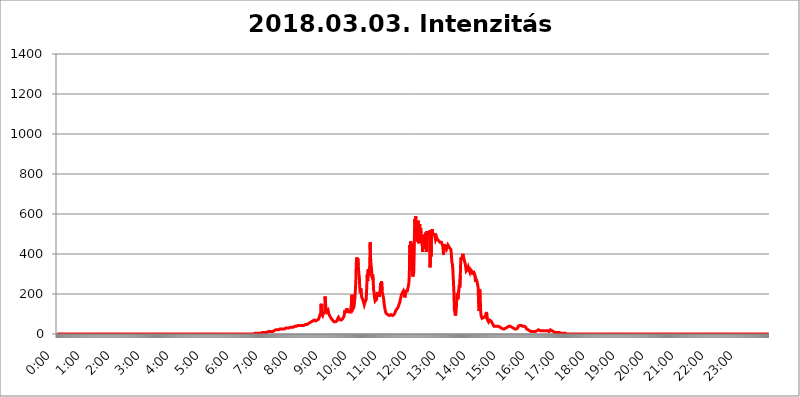
| Category | 2018.03.03. Intenzitás [W/m^2] |
|---|---|
| 0.0 | 0 |
| 0.0006944444444444445 | 0 |
| 0.001388888888888889 | 0 |
| 0.0020833333333333333 | 0 |
| 0.002777777777777778 | 0 |
| 0.003472222222222222 | 0 |
| 0.004166666666666667 | 0 |
| 0.004861111111111111 | 0 |
| 0.005555555555555556 | 0 |
| 0.0062499999999999995 | 0 |
| 0.006944444444444444 | 0 |
| 0.007638888888888889 | 0 |
| 0.008333333333333333 | 0 |
| 0.009027777777777779 | 0 |
| 0.009722222222222222 | 0 |
| 0.010416666666666666 | 0 |
| 0.011111111111111112 | 0 |
| 0.011805555555555555 | 0 |
| 0.012499999999999999 | 0 |
| 0.013194444444444444 | 0 |
| 0.013888888888888888 | 0 |
| 0.014583333333333332 | 0 |
| 0.015277777777777777 | 0 |
| 0.015972222222222224 | 0 |
| 0.016666666666666666 | 0 |
| 0.017361111111111112 | 0 |
| 0.018055555555555557 | 0 |
| 0.01875 | 0 |
| 0.019444444444444445 | 0 |
| 0.02013888888888889 | 0 |
| 0.020833333333333332 | 0 |
| 0.02152777777777778 | 0 |
| 0.022222222222222223 | 0 |
| 0.02291666666666667 | 0 |
| 0.02361111111111111 | 0 |
| 0.024305555555555556 | 0 |
| 0.024999999999999998 | 0 |
| 0.025694444444444447 | 0 |
| 0.02638888888888889 | 0 |
| 0.027083333333333334 | 0 |
| 0.027777777777777776 | 0 |
| 0.02847222222222222 | 0 |
| 0.029166666666666664 | 0 |
| 0.029861111111111113 | 0 |
| 0.030555555555555555 | 0 |
| 0.03125 | 0 |
| 0.03194444444444445 | 0 |
| 0.03263888888888889 | 0 |
| 0.03333333333333333 | 0 |
| 0.034027777777777775 | 0 |
| 0.034722222222222224 | 0 |
| 0.035416666666666666 | 0 |
| 0.036111111111111115 | 0 |
| 0.03680555555555556 | 0 |
| 0.0375 | 0 |
| 0.03819444444444444 | 0 |
| 0.03888888888888889 | 0 |
| 0.03958333333333333 | 0 |
| 0.04027777777777778 | 0 |
| 0.04097222222222222 | 0 |
| 0.041666666666666664 | 0 |
| 0.042361111111111106 | 0 |
| 0.04305555555555556 | 0 |
| 0.043750000000000004 | 0 |
| 0.044444444444444446 | 0 |
| 0.04513888888888889 | 0 |
| 0.04583333333333334 | 0 |
| 0.04652777777777778 | 0 |
| 0.04722222222222222 | 0 |
| 0.04791666666666666 | 0 |
| 0.04861111111111111 | 0 |
| 0.049305555555555554 | 0 |
| 0.049999999999999996 | 0 |
| 0.05069444444444445 | 0 |
| 0.051388888888888894 | 0 |
| 0.052083333333333336 | 0 |
| 0.05277777777777778 | 0 |
| 0.05347222222222222 | 0 |
| 0.05416666666666667 | 0 |
| 0.05486111111111111 | 0 |
| 0.05555555555555555 | 0 |
| 0.05625 | 0 |
| 0.05694444444444444 | 0 |
| 0.057638888888888885 | 0 |
| 0.05833333333333333 | 0 |
| 0.05902777777777778 | 0 |
| 0.059722222222222225 | 0 |
| 0.06041666666666667 | 0 |
| 0.061111111111111116 | 0 |
| 0.06180555555555556 | 0 |
| 0.0625 | 0 |
| 0.06319444444444444 | 0 |
| 0.06388888888888888 | 0 |
| 0.06458333333333334 | 0 |
| 0.06527777777777778 | 0 |
| 0.06597222222222222 | 0 |
| 0.06666666666666667 | 0 |
| 0.06736111111111111 | 0 |
| 0.06805555555555555 | 0 |
| 0.06874999999999999 | 0 |
| 0.06944444444444443 | 0 |
| 0.07013888888888889 | 0 |
| 0.07083333333333333 | 0 |
| 0.07152777777777779 | 0 |
| 0.07222222222222223 | 0 |
| 0.07291666666666667 | 0 |
| 0.07361111111111111 | 0 |
| 0.07430555555555556 | 0 |
| 0.075 | 0 |
| 0.07569444444444444 | 0 |
| 0.0763888888888889 | 0 |
| 0.07708333333333334 | 0 |
| 0.07777777777777778 | 0 |
| 0.07847222222222222 | 0 |
| 0.07916666666666666 | 0 |
| 0.0798611111111111 | 0 |
| 0.08055555555555556 | 0 |
| 0.08125 | 0 |
| 0.08194444444444444 | 0 |
| 0.08263888888888889 | 0 |
| 0.08333333333333333 | 0 |
| 0.08402777777777777 | 0 |
| 0.08472222222222221 | 0 |
| 0.08541666666666665 | 0 |
| 0.08611111111111112 | 0 |
| 0.08680555555555557 | 0 |
| 0.08750000000000001 | 0 |
| 0.08819444444444445 | 0 |
| 0.08888888888888889 | 0 |
| 0.08958333333333333 | 0 |
| 0.09027777777777778 | 0 |
| 0.09097222222222222 | 0 |
| 0.09166666666666667 | 0 |
| 0.09236111111111112 | 0 |
| 0.09305555555555556 | 0 |
| 0.09375 | 0 |
| 0.09444444444444444 | 0 |
| 0.09513888888888888 | 0 |
| 0.09583333333333333 | 0 |
| 0.09652777777777777 | 0 |
| 0.09722222222222222 | 0 |
| 0.09791666666666667 | 0 |
| 0.09861111111111111 | 0 |
| 0.09930555555555555 | 0 |
| 0.09999999999999999 | 0 |
| 0.10069444444444443 | 0 |
| 0.1013888888888889 | 0 |
| 0.10208333333333335 | 0 |
| 0.10277777777777779 | 0 |
| 0.10347222222222223 | 0 |
| 0.10416666666666667 | 0 |
| 0.10486111111111111 | 0 |
| 0.10555555555555556 | 0 |
| 0.10625 | 0 |
| 0.10694444444444444 | 0 |
| 0.1076388888888889 | 0 |
| 0.10833333333333334 | 0 |
| 0.10902777777777778 | 0 |
| 0.10972222222222222 | 0 |
| 0.1111111111111111 | 0 |
| 0.11180555555555556 | 0 |
| 0.11180555555555556 | 0 |
| 0.1125 | 0 |
| 0.11319444444444444 | 0 |
| 0.11388888888888889 | 0 |
| 0.11458333333333333 | 0 |
| 0.11527777777777777 | 0 |
| 0.11597222222222221 | 0 |
| 0.11666666666666665 | 0 |
| 0.1173611111111111 | 0 |
| 0.11805555555555557 | 0 |
| 0.11944444444444445 | 0 |
| 0.12013888888888889 | 0 |
| 0.12083333333333333 | 0 |
| 0.12152777777777778 | 0 |
| 0.12222222222222223 | 0 |
| 0.12291666666666667 | 0 |
| 0.12291666666666667 | 0 |
| 0.12361111111111112 | 0 |
| 0.12430555555555556 | 0 |
| 0.125 | 0 |
| 0.12569444444444444 | 0 |
| 0.12638888888888888 | 0 |
| 0.12708333333333333 | 0 |
| 0.16875 | 0 |
| 0.12847222222222224 | 0 |
| 0.12916666666666668 | 0 |
| 0.12986111111111112 | 0 |
| 0.13055555555555556 | 0 |
| 0.13125 | 0 |
| 0.13194444444444445 | 0 |
| 0.1326388888888889 | 0 |
| 0.13333333333333333 | 0 |
| 0.13402777777777777 | 0 |
| 0.13402777777777777 | 0 |
| 0.13472222222222222 | 0 |
| 0.13541666666666666 | 0 |
| 0.1361111111111111 | 0 |
| 0.13749999999999998 | 0 |
| 0.13819444444444443 | 0 |
| 0.1388888888888889 | 0 |
| 0.13958333333333334 | 0 |
| 0.14027777777777778 | 0 |
| 0.14097222222222222 | 0 |
| 0.14166666666666666 | 0 |
| 0.1423611111111111 | 0 |
| 0.14305555555555557 | 0 |
| 0.14375000000000002 | 0 |
| 0.14444444444444446 | 0 |
| 0.1451388888888889 | 0 |
| 0.1451388888888889 | 0 |
| 0.14652777777777778 | 0 |
| 0.14722222222222223 | 0 |
| 0.14791666666666667 | 0 |
| 0.1486111111111111 | 0 |
| 0.14930555555555555 | 0 |
| 0.15 | 0 |
| 0.15069444444444444 | 0 |
| 0.15138888888888888 | 0 |
| 0.15208333333333332 | 0 |
| 0.15277777777777776 | 0 |
| 0.15347222222222223 | 0 |
| 0.15416666666666667 | 0 |
| 0.15486111111111112 | 0 |
| 0.15555555555555556 | 0 |
| 0.15625 | 0 |
| 0.15694444444444444 | 0 |
| 0.15763888888888888 | 0 |
| 0.15833333333333333 | 0 |
| 0.15902777777777777 | 0 |
| 0.15972222222222224 | 0 |
| 0.16041666666666668 | 0 |
| 0.16111111111111112 | 0 |
| 0.16180555555555556 | 0 |
| 0.1625 | 0 |
| 0.16319444444444445 | 0 |
| 0.1638888888888889 | 0 |
| 0.16458333333333333 | 0 |
| 0.16527777777777777 | 0 |
| 0.16597222222222222 | 0 |
| 0.16666666666666666 | 0 |
| 0.1673611111111111 | 0 |
| 0.16805555555555554 | 0 |
| 0.16874999999999998 | 0 |
| 0.16944444444444443 | 0 |
| 0.17013888888888887 | 0 |
| 0.1708333333333333 | 0 |
| 0.17152777777777775 | 0 |
| 0.17222222222222225 | 0 |
| 0.1729166666666667 | 0 |
| 0.17361111111111113 | 0 |
| 0.17430555555555557 | 0 |
| 0.17500000000000002 | 0 |
| 0.17569444444444446 | 0 |
| 0.1763888888888889 | 0 |
| 0.17708333333333334 | 0 |
| 0.17777777777777778 | 0 |
| 0.17847222222222223 | 0 |
| 0.17916666666666667 | 0 |
| 0.1798611111111111 | 0 |
| 0.18055555555555555 | 0 |
| 0.18125 | 0 |
| 0.18194444444444444 | 0 |
| 0.1826388888888889 | 0 |
| 0.18333333333333335 | 0 |
| 0.1840277777777778 | 0 |
| 0.18472222222222223 | 0 |
| 0.18541666666666667 | 0 |
| 0.18611111111111112 | 0 |
| 0.18680555555555556 | 0 |
| 0.1875 | 0 |
| 0.18819444444444444 | 0 |
| 0.18888888888888888 | 0 |
| 0.18958333333333333 | 0 |
| 0.19027777777777777 | 0 |
| 0.1909722222222222 | 0 |
| 0.19166666666666665 | 0 |
| 0.19236111111111112 | 0 |
| 0.19305555555555554 | 0 |
| 0.19375 | 0 |
| 0.19444444444444445 | 0 |
| 0.1951388888888889 | 0 |
| 0.19583333333333333 | 0 |
| 0.19652777777777777 | 0 |
| 0.19722222222222222 | 0 |
| 0.19791666666666666 | 0 |
| 0.1986111111111111 | 0 |
| 0.19930555555555554 | 0 |
| 0.19999999999999998 | 0 |
| 0.20069444444444443 | 0 |
| 0.20138888888888887 | 0 |
| 0.2020833333333333 | 0 |
| 0.2027777777777778 | 0 |
| 0.2034722222222222 | 0 |
| 0.2041666666666667 | 0 |
| 0.20486111111111113 | 0 |
| 0.20555555555555557 | 0 |
| 0.20625000000000002 | 0 |
| 0.20694444444444446 | 0 |
| 0.2076388888888889 | 0 |
| 0.20833333333333334 | 0 |
| 0.20902777777777778 | 0 |
| 0.20972222222222223 | 0 |
| 0.21041666666666667 | 0 |
| 0.2111111111111111 | 0 |
| 0.21180555555555555 | 0 |
| 0.2125 | 0 |
| 0.21319444444444444 | 0 |
| 0.2138888888888889 | 0 |
| 0.21458333333333335 | 0 |
| 0.2152777777777778 | 0 |
| 0.21597222222222223 | 0 |
| 0.21666666666666667 | 0 |
| 0.21736111111111112 | 0 |
| 0.21805555555555556 | 0 |
| 0.21875 | 0 |
| 0.21944444444444444 | 0 |
| 0.22013888888888888 | 0 |
| 0.22083333333333333 | 0 |
| 0.22152777777777777 | 0 |
| 0.2222222222222222 | 0 |
| 0.22291666666666665 | 0 |
| 0.2236111111111111 | 0 |
| 0.22430555555555556 | 0 |
| 0.225 | 0 |
| 0.22569444444444445 | 0 |
| 0.2263888888888889 | 0 |
| 0.22708333333333333 | 0 |
| 0.22777777777777777 | 0 |
| 0.22847222222222222 | 0 |
| 0.22916666666666666 | 0 |
| 0.2298611111111111 | 0 |
| 0.23055555555555554 | 0 |
| 0.23124999999999998 | 0 |
| 0.23194444444444443 | 0 |
| 0.23263888888888887 | 0 |
| 0.2333333333333333 | 0 |
| 0.2340277777777778 | 0 |
| 0.2347222222222222 | 0 |
| 0.2354166666666667 | 0 |
| 0.23611111111111113 | 0 |
| 0.23680555555555557 | 0 |
| 0.23750000000000002 | 0 |
| 0.23819444444444446 | 0 |
| 0.2388888888888889 | 0 |
| 0.23958333333333334 | 0 |
| 0.24027777777777778 | 0 |
| 0.24097222222222223 | 0 |
| 0.24166666666666667 | 0 |
| 0.2423611111111111 | 0 |
| 0.24305555555555555 | 0 |
| 0.24375 | 0 |
| 0.24444444444444446 | 0 |
| 0.24513888888888888 | 0 |
| 0.24583333333333335 | 0 |
| 0.2465277777777778 | 0 |
| 0.24722222222222223 | 0 |
| 0.24791666666666667 | 0 |
| 0.24861111111111112 | 0 |
| 0.24930555555555556 | 0 |
| 0.25 | 0 |
| 0.25069444444444444 | 0 |
| 0.2513888888888889 | 0 |
| 0.2520833333333333 | 0 |
| 0.25277777777777777 | 0 |
| 0.2534722222222222 | 0 |
| 0.25416666666666665 | 0 |
| 0.2548611111111111 | 0 |
| 0.2555555555555556 | 0 |
| 0.25625000000000003 | 0 |
| 0.2569444444444445 | 0 |
| 0.2576388888888889 | 0 |
| 0.25833333333333336 | 0 |
| 0.2590277777777778 | 0 |
| 0.25972222222222224 | 0 |
| 0.2604166666666667 | 0 |
| 0.2611111111111111 | 0 |
| 0.26180555555555557 | 0 |
| 0.2625 | 0 |
| 0.26319444444444445 | 0 |
| 0.2638888888888889 | 0 |
| 0.26458333333333334 | 0 |
| 0.2652777777777778 | 0 |
| 0.2659722222222222 | 0 |
| 0.26666666666666666 | 0 |
| 0.2673611111111111 | 0 |
| 0.26805555555555555 | 0 |
| 0.26875 | 0 |
| 0.26944444444444443 | 0 |
| 0.2701388888888889 | 0 |
| 0.2708333333333333 | 0 |
| 0.27152777777777776 | 0 |
| 0.2722222222222222 | 0 |
| 0.27291666666666664 | 0 |
| 0.2736111111111111 | 0 |
| 0.2743055555555555 | 0 |
| 0.27499999999999997 | 0 |
| 0.27569444444444446 | 0 |
| 0.27638888888888885 | 0 |
| 0.27708333333333335 | 3.525 |
| 0.2777777777777778 | 3.525 |
| 0.27847222222222223 | 3.525 |
| 0.2791666666666667 | 3.525 |
| 0.2798611111111111 | 3.525 |
| 0.28055555555555556 | 3.525 |
| 0.28125 | 3.525 |
| 0.28194444444444444 | 3.525 |
| 0.2826388888888889 | 3.525 |
| 0.2833333333333333 | 3.525 |
| 0.28402777777777777 | 3.525 |
| 0.2847222222222222 | 3.525 |
| 0.28541666666666665 | 3.525 |
| 0.28611111111111115 | 3.525 |
| 0.28680555555555554 | 3.525 |
| 0.28750000000000003 | 7.887 |
| 0.2881944444444445 | 7.887 |
| 0.2888888888888889 | 3.525 |
| 0.28958333333333336 | 7.887 |
| 0.2902777777777778 | 7.887 |
| 0.29097222222222224 | 7.887 |
| 0.2916666666666667 | 7.887 |
| 0.2923611111111111 | 7.887 |
| 0.29305555555555557 | 7.887 |
| 0.29375 | 7.887 |
| 0.29444444444444445 | 12.257 |
| 0.2951388888888889 | 12.257 |
| 0.29583333333333334 | 12.257 |
| 0.2965277777777778 | 12.257 |
| 0.2972222222222222 | 12.257 |
| 0.29791666666666666 | 12.257 |
| 0.2986111111111111 | 12.257 |
| 0.29930555555555555 | 12.257 |
| 0.3 | 12.257 |
| 0.30069444444444443 | 12.257 |
| 0.3013888888888889 | 12.257 |
| 0.3020833333333333 | 12.257 |
| 0.30277777777777776 | 16.636 |
| 0.3034722222222222 | 16.636 |
| 0.30416666666666664 | 16.636 |
| 0.3048611111111111 | 16.636 |
| 0.3055555555555555 | 16.636 |
| 0.30624999999999997 | 21.024 |
| 0.3069444444444444 | 21.024 |
| 0.3076388888888889 | 21.024 |
| 0.30833333333333335 | 21.024 |
| 0.3090277777777778 | 21.024 |
| 0.30972222222222223 | 21.024 |
| 0.3104166666666667 | 21.024 |
| 0.3111111111111111 | 21.024 |
| 0.31180555555555556 | 25.419 |
| 0.3125 | 25.419 |
| 0.31319444444444444 | 21.024 |
| 0.3138888888888889 | 21.024 |
| 0.3145833333333333 | 25.419 |
| 0.31527777777777777 | 25.419 |
| 0.3159722222222222 | 25.419 |
| 0.31666666666666665 | 25.419 |
| 0.31736111111111115 | 25.419 |
| 0.31805555555555554 | 25.419 |
| 0.31875000000000003 | 25.419 |
| 0.3194444444444445 | 25.419 |
| 0.3201388888888889 | 29.823 |
| 0.32083333333333336 | 29.823 |
| 0.3215277777777778 | 29.823 |
| 0.32222222222222224 | 29.823 |
| 0.3229166666666667 | 29.823 |
| 0.3236111111111111 | 29.823 |
| 0.32430555555555557 | 29.823 |
| 0.325 | 29.823 |
| 0.32569444444444445 | 29.823 |
| 0.3263888888888889 | 29.823 |
| 0.32708333333333334 | 34.234 |
| 0.3277777777777778 | 29.823 |
| 0.3284722222222222 | 29.823 |
| 0.32916666666666666 | 34.234 |
| 0.3298611111111111 | 34.234 |
| 0.33055555555555555 | 34.234 |
| 0.33125 | 34.234 |
| 0.33194444444444443 | 34.234 |
| 0.3326388888888889 | 38.653 |
| 0.3333333333333333 | 38.653 |
| 0.3340277777777778 | 38.653 |
| 0.3347222222222222 | 38.653 |
| 0.3354166666666667 | 38.653 |
| 0.3361111111111111 | 38.653 |
| 0.3368055555555556 | 38.653 |
| 0.33749999999999997 | 43.079 |
| 0.33819444444444446 | 43.079 |
| 0.33888888888888885 | 43.079 |
| 0.33958333333333335 | 43.079 |
| 0.34027777777777773 | 43.079 |
| 0.34097222222222223 | 43.079 |
| 0.3416666666666666 | 43.079 |
| 0.3423611111111111 | 43.079 |
| 0.3430555555555555 | 43.079 |
| 0.34375 | 43.079 |
| 0.3444444444444445 | 43.079 |
| 0.3451388888888889 | 43.079 |
| 0.3458333333333334 | 43.079 |
| 0.34652777777777777 | 43.079 |
| 0.34722222222222227 | 47.511 |
| 0.34791666666666665 | 47.511 |
| 0.34861111111111115 | 47.511 |
| 0.34930555555555554 | 47.511 |
| 0.35000000000000003 | 47.511 |
| 0.3506944444444444 | 47.511 |
| 0.3513888888888889 | 47.511 |
| 0.3520833333333333 | 51.951 |
| 0.3527777777777778 | 51.951 |
| 0.3534722222222222 | 51.951 |
| 0.3541666666666667 | 56.398 |
| 0.3548611111111111 | 56.398 |
| 0.35555555555555557 | 56.398 |
| 0.35625 | 60.85 |
| 0.35694444444444445 | 60.85 |
| 0.3576388888888889 | 65.31 |
| 0.35833333333333334 | 65.31 |
| 0.3590277777777778 | 65.31 |
| 0.3597222222222222 | 65.31 |
| 0.36041666666666666 | 69.775 |
| 0.3611111111111111 | 69.775 |
| 0.36180555555555555 | 69.775 |
| 0.3625 | 65.31 |
| 0.36319444444444443 | 65.31 |
| 0.3638888888888889 | 65.31 |
| 0.3645833333333333 | 69.775 |
| 0.3652777777777778 | 69.775 |
| 0.3659722222222222 | 74.246 |
| 0.3666666666666667 | 74.246 |
| 0.3673611111111111 | 83.205 |
| 0.3680555555555556 | 78.722 |
| 0.36874999999999997 | 78.722 |
| 0.36944444444444446 | 105.69 |
| 0.37013888888888885 | 150.964 |
| 0.37083333333333335 | 101.184 |
| 0.37152777777777773 | 96.682 |
| 0.37222222222222223 | 92.184 |
| 0.3729166666666666 | 101.184 |
| 0.3736111111111111 | 105.69 |
| 0.3743055555555555 | 105.69 |
| 0.375 | 110.201 |
| 0.3756944444444445 | 187.378 |
| 0.3763888888888889 | 150.964 |
| 0.3770833333333334 | 119.235 |
| 0.37777777777777777 | 110.201 |
| 0.37847222222222227 | 105.69 |
| 0.37916666666666665 | 110.201 |
| 0.37986111111111115 | 119.235 |
| 0.38055555555555554 | 105.69 |
| 0.38125000000000003 | 96.682 |
| 0.3819444444444444 | 92.184 |
| 0.3826388888888889 | 87.692 |
| 0.3833333333333333 | 83.205 |
| 0.3840277777777778 | 78.722 |
| 0.3847222222222222 | 74.246 |
| 0.3854166666666667 | 74.246 |
| 0.3861111111111111 | 69.775 |
| 0.38680555555555557 | 65.31 |
| 0.3875 | 65.31 |
| 0.38819444444444445 | 60.85 |
| 0.3888888888888889 | 60.85 |
| 0.38958333333333334 | 60.85 |
| 0.3902777777777778 | 60.85 |
| 0.3909722222222222 | 65.31 |
| 0.39166666666666666 | 65.31 |
| 0.3923611111111111 | 65.31 |
| 0.39305555555555555 | 74.246 |
| 0.39375 | 78.722 |
| 0.39444444444444443 | 83.205 |
| 0.3951388888888889 | 78.722 |
| 0.3958333333333333 | 74.246 |
| 0.3965277777777778 | 74.246 |
| 0.3972222222222222 | 69.775 |
| 0.3979166666666667 | 69.775 |
| 0.3986111111111111 | 69.775 |
| 0.3993055555555556 | 74.246 |
| 0.39999999999999997 | 74.246 |
| 0.40069444444444446 | 74.246 |
| 0.40138888888888885 | 78.722 |
| 0.40208333333333335 | 87.692 |
| 0.40277777777777773 | 101.184 |
| 0.40347222222222223 | 119.235 |
| 0.4041666666666666 | 105.69 |
| 0.4048611111111111 | 105.69 |
| 0.4055555555555555 | 110.201 |
| 0.40625 | 128.284 |
| 0.4069444444444445 | 114.716 |
| 0.4076388888888889 | 110.201 |
| 0.4083333333333334 | 110.201 |
| 0.40902777777777777 | 110.201 |
| 0.40972222222222227 | 110.201 |
| 0.41041666666666665 | 114.716 |
| 0.41111111111111115 | 110.201 |
| 0.41180555555555554 | 110.201 |
| 0.41250000000000003 | 146.423 |
| 0.4131944444444444 | 196.497 |
| 0.4138888888888889 | 160.056 |
| 0.4145833333333333 | 123.758 |
| 0.4152777777777778 | 119.235 |
| 0.4159722222222222 | 132.814 |
| 0.4166666666666667 | 150.964 |
| 0.4173611111111111 | 173.709 |
| 0.41805555555555557 | 178.264 |
| 0.41875 | 260.373 |
| 0.41944444444444445 | 360.221 |
| 0.4201388888888889 | 382.715 |
| 0.42083333333333334 | 369.23 |
| 0.4215277777777778 | 378.224 |
| 0.4222222222222222 | 342.162 |
| 0.42291666666666666 | 301.354 |
| 0.4236111111111111 | 287.709 |
| 0.42430555555555555 | 233 |
| 0.425 | 205.62 |
| 0.42569444444444443 | 228.436 |
| 0.4263888888888889 | 201.058 |
| 0.4270833333333333 | 182.82 |
| 0.4277777777777778 | 182.82 |
| 0.4284722222222222 | 173.709 |
| 0.4291666666666667 | 169.156 |
| 0.4298611111111111 | 155.509 |
| 0.4305555555555556 | 146.423 |
| 0.43124999999999997 | 155.509 |
| 0.43194444444444446 | 160.056 |
| 0.43263888888888885 | 155.509 |
| 0.43333333333333335 | 173.709 |
| 0.43402777777777773 | 228.436 |
| 0.43472222222222223 | 296.808 |
| 0.4354166666666666 | 264.932 |
| 0.4361111111111111 | 324.052 |
| 0.4368055555555555 | 310.44 |
| 0.4375 | 292.259 |
| 0.4381944444444445 | 337.639 |
| 0.4388888888888889 | 458.38 |
| 0.4395833333333334 | 369.23 |
| 0.44027777777777777 | 364.728 |
| 0.44097222222222227 | 314.98 |
| 0.44166666666666665 | 278.603 |
| 0.44236111111111115 | 296.808 |
| 0.44305555555555554 | 269.49 |
| 0.44375000000000003 | 219.309 |
| 0.4444444444444444 | 205.62 |
| 0.4451388888888889 | 178.264 |
| 0.4458333333333333 | 164.605 |
| 0.4465277777777778 | 164.605 |
| 0.4472222222222222 | 164.605 |
| 0.4479166666666667 | 173.709 |
| 0.4486111111111111 | 196.497 |
| 0.44930555555555557 | 210.182 |
| 0.45 | 191.937 |
| 0.45069444444444445 | 191.937 |
| 0.4513888888888889 | 187.378 |
| 0.45208333333333334 | 191.937 |
| 0.4527777777777778 | 214.746 |
| 0.4534722222222222 | 255.813 |
| 0.45416666666666666 | 214.746 |
| 0.4548611111111111 | 264.932 |
| 0.45555555555555555 | 219.309 |
| 0.45625 | 201.058 |
| 0.45694444444444443 | 191.937 |
| 0.4576388888888889 | 178.264 |
| 0.4583333333333333 | 155.509 |
| 0.4590277777777778 | 137.347 |
| 0.4597222222222222 | 123.758 |
| 0.4604166666666667 | 110.201 |
| 0.4611111111111111 | 105.69 |
| 0.4618055555555556 | 101.184 |
| 0.46249999999999997 | 101.184 |
| 0.46319444444444446 | 96.682 |
| 0.46388888888888885 | 96.682 |
| 0.46458333333333335 | 92.184 |
| 0.46527777777777773 | 92.184 |
| 0.46597222222222223 | 92.184 |
| 0.4666666666666666 | 96.682 |
| 0.4673611111111111 | 96.682 |
| 0.4680555555555555 | 96.682 |
| 0.46875 | 92.184 |
| 0.4694444444444445 | 92.184 |
| 0.4701388888888889 | 92.184 |
| 0.4708333333333334 | 92.184 |
| 0.47152777777777777 | 92.184 |
| 0.47222222222222227 | 96.682 |
| 0.47291666666666665 | 101.184 |
| 0.47361111111111115 | 105.69 |
| 0.47430555555555554 | 110.201 |
| 0.47500000000000003 | 119.235 |
| 0.4756944444444444 | 119.235 |
| 0.4763888888888889 | 123.758 |
| 0.4770833333333333 | 128.284 |
| 0.4777777777777778 | 132.814 |
| 0.4784722222222222 | 137.347 |
| 0.4791666666666667 | 146.423 |
| 0.4798611111111111 | 150.964 |
| 0.48055555555555557 | 160.056 |
| 0.48125 | 173.709 |
| 0.48194444444444445 | 182.82 |
| 0.4826388888888889 | 196.497 |
| 0.48333333333333334 | 196.497 |
| 0.4840277777777778 | 205.62 |
| 0.4847222222222222 | 210.182 |
| 0.48541666666666666 | 214.746 |
| 0.4861111111111111 | 210.182 |
| 0.48680555555555555 | 196.497 |
| 0.4875 | 182.82 |
| 0.48819444444444443 | 191.937 |
| 0.4888888888888889 | 214.746 |
| 0.4895833333333333 | 214.746 |
| 0.4902777777777778 | 210.182 |
| 0.4909722222222222 | 214.746 |
| 0.4916666666666667 | 210.182 |
| 0.4923611111111111 | 214.746 |
| 0.4930555555555556 | 251.251 |
| 0.49374999999999997 | 287.709 |
| 0.49444444444444446 | 445.129 |
| 0.49513888888888885 | 378.224 |
| 0.49583333333333335 | 462.786 |
| 0.49652777777777773 | 414.035 |
| 0.49722222222222223 | 409.574 |
| 0.4979166666666666 | 449.551 |
| 0.4986111111111111 | 287.709 |
| 0.4993055555555555 | 296.808 |
| 0.5 | 305.898 |
| 0.5006944444444444 | 422.943 |
| 0.5013888888888889 | 575.299 |
| 0.5020833333333333 | 549.704 |
| 0.5027777777777778 | 588.009 |
| 0.5034722222222222 | 484.735 |
| 0.5041666666666667 | 545.416 |
| 0.5048611111111111 | 462.786 |
| 0.5055555555555555 | 480.356 |
| 0.50625 | 566.793 |
| 0.5069444444444444 | 453.968 |
| 0.5076388888888889 | 541.121 |
| 0.5083333333333333 | 549.704 |
| 0.5090277777777777 | 506.542 |
| 0.5097222222222222 | 528.2 |
| 0.5104166666666666 | 489.108 |
| 0.5111111111111112 | 453.968 |
| 0.5118055555555555 | 462.786 |
| 0.5125000000000001 | 409.574 |
| 0.5131944444444444 | 493.475 |
| 0.513888888888889 | 475.972 |
| 0.5145833333333333 | 427.39 |
| 0.5152777777777778 | 497.836 |
| 0.5159722222222222 | 471.582 |
| 0.5166666666666667 | 506.542 |
| 0.517361111111111 | 431.833 |
| 0.5180555555555556 | 409.574 |
| 0.5187499999999999 | 515.223 |
| 0.5194444444444445 | 506.542 |
| 0.5201388888888888 | 506.542 |
| 0.5208333333333334 | 506.542 |
| 0.5215277777777778 | 510.885 |
| 0.5222222222222223 | 502.192 |
| 0.5229166666666667 | 333.113 |
| 0.5236111111111111 | 458.38 |
| 0.5243055555555556 | 387.202 |
| 0.525 | 510.885 |
| 0.5256944444444445 | 523.88 |
| 0.5263888888888889 | 510.885 |
| 0.5270833333333333 | 497.836 |
| 0.5277777777777778 | 493.475 |
| 0.5284722222222222 | 497.836 |
| 0.5291666666666667 | 497.836 |
| 0.5298611111111111 | 484.735 |
| 0.5305555555555556 | 471.582 |
| 0.53125 | 475.972 |
| 0.5319444444444444 | 484.735 |
| 0.5326388888888889 | 475.972 |
| 0.5333333333333333 | 480.356 |
| 0.5340277777777778 | 480.356 |
| 0.5347222222222222 | 467.187 |
| 0.5354166666666667 | 471.582 |
| 0.5361111111111111 | 471.582 |
| 0.5368055555555555 | 458.38 |
| 0.5375 | 462.786 |
| 0.5381944444444444 | 462.786 |
| 0.5388888888888889 | 458.38 |
| 0.5395833333333333 | 458.38 |
| 0.5402777777777777 | 453.968 |
| 0.5409722222222222 | 436.27 |
| 0.5416666666666666 | 396.164 |
| 0.5423611111111112 | 400.638 |
| 0.5430555555555555 | 449.551 |
| 0.5437500000000001 | 436.27 |
| 0.5444444444444444 | 436.27 |
| 0.545138888888889 | 440.702 |
| 0.5458333333333333 | 422.943 |
| 0.5465277777777778 | 418.492 |
| 0.5472222222222222 | 427.39 |
| 0.5479166666666667 | 445.129 |
| 0.548611111111111 | 449.551 |
| 0.5493055555555556 | 445.129 |
| 0.5499999999999999 | 431.833 |
| 0.5506944444444445 | 427.39 |
| 0.5513888888888888 | 436.27 |
| 0.5520833333333334 | 422.943 |
| 0.5527777777777778 | 396.164 |
| 0.5534722222222223 | 360.221 |
| 0.5541666666666667 | 351.198 |
| 0.5548611111111111 | 319.517 |
| 0.5555555555555556 | 269.49 |
| 0.55625 | 214.746 |
| 0.5569444444444445 | 123.758 |
| 0.5576388888888889 | 110.201 |
| 0.5583333333333333 | 92.184 |
| 0.5590277777777778 | 101.184 |
| 0.5597222222222222 | 128.284 |
| 0.5604166666666667 | 187.378 |
| 0.5611111111111111 | 205.62 |
| 0.5618055555555556 | 173.709 |
| 0.5625 | 173.709 |
| 0.5631944444444444 | 219.309 |
| 0.5638888888888889 | 246.689 |
| 0.5645833333333333 | 233 |
| 0.5652777777777778 | 292.259 |
| 0.5659722222222222 | 373.729 |
| 0.5666666666666667 | 382.715 |
| 0.5673611111111111 | 369.23 |
| 0.5680555555555555 | 373.729 |
| 0.56875 | 400.638 |
| 0.5694444444444444 | 396.164 |
| 0.5701388888888889 | 378.224 |
| 0.5708333333333333 | 369.23 |
| 0.5715277777777777 | 364.728 |
| 0.5722222222222222 | 351.198 |
| 0.5729166666666666 | 333.113 |
| 0.5736111111111112 | 314.98 |
| 0.5743055555555555 | 314.98 |
| 0.5750000000000001 | 314.98 |
| 0.5756944444444444 | 324.052 |
| 0.576388888888889 | 333.113 |
| 0.5770833333333333 | 324.052 |
| 0.5777777777777778 | 324.052 |
| 0.5784722222222222 | 310.44 |
| 0.5791666666666667 | 324.052 |
| 0.579861111111111 | 328.584 |
| 0.5805555555555556 | 324.052 |
| 0.5812499999999999 | 314.98 |
| 0.5819444444444445 | 310.44 |
| 0.5826388888888888 | 296.808 |
| 0.5833333333333334 | 314.98 |
| 0.5840277777777778 | 314.98 |
| 0.5847222222222223 | 314.98 |
| 0.5854166666666667 | 296.808 |
| 0.5861111111111111 | 301.354 |
| 0.5868055555555556 | 260.373 |
| 0.5875 | 274.047 |
| 0.5881944444444445 | 274.047 |
| 0.5888888888888889 | 260.373 |
| 0.5895833333333333 | 255.813 |
| 0.5902777777777778 | 233 |
| 0.5909722222222222 | 155.509 |
| 0.5916666666666667 | 114.716 |
| 0.5923611111111111 | 223.873 |
| 0.5930555555555556 | 210.182 |
| 0.59375 | 119.235 |
| 0.5944444444444444 | 92.184 |
| 0.5951388888888889 | 87.692 |
| 0.5958333333333333 | 78.722 |
| 0.5965277777777778 | 78.722 |
| 0.5972222222222222 | 83.205 |
| 0.5979166666666667 | 83.205 |
| 0.5986111111111111 | 83.205 |
| 0.5993055555555555 | 87.692 |
| 0.6 | 83.205 |
| 0.6006944444444444 | 83.205 |
| 0.6013888888888889 | 78.722 |
| 0.6020833333333333 | 110.201 |
| 0.6027777777777777 | 78.722 |
| 0.6034722222222222 | 69.775 |
| 0.6041666666666666 | 65.31 |
| 0.6048611111111112 | 60.85 |
| 0.6055555555555555 | 65.31 |
| 0.6062500000000001 | 69.775 |
| 0.6069444444444444 | 69.775 |
| 0.607638888888889 | 65.31 |
| 0.6083333333333333 | 65.31 |
| 0.6090277777777778 | 65.31 |
| 0.6097222222222222 | 56.398 |
| 0.6104166666666667 | 51.951 |
| 0.611111111111111 | 47.511 |
| 0.6118055555555556 | 43.079 |
| 0.6124999999999999 | 38.653 |
| 0.6131944444444445 | 38.653 |
| 0.6138888888888888 | 38.653 |
| 0.6145833333333334 | 38.653 |
| 0.6152777777777778 | 38.653 |
| 0.6159722222222223 | 38.653 |
| 0.6166666666666667 | 38.653 |
| 0.6173611111111111 | 38.653 |
| 0.6180555555555556 | 38.653 |
| 0.61875 | 38.653 |
| 0.6194444444444445 | 38.653 |
| 0.6201388888888889 | 38.653 |
| 0.6208333333333333 | 34.234 |
| 0.6215277777777778 | 34.234 |
| 0.6222222222222222 | 29.823 |
| 0.6229166666666667 | 29.823 |
| 0.6236111111111111 | 29.823 |
| 0.6243055555555556 | 25.419 |
| 0.625 | 25.419 |
| 0.6256944444444444 | 25.419 |
| 0.6263888888888889 | 25.419 |
| 0.6270833333333333 | 25.419 |
| 0.6277777777777778 | 29.823 |
| 0.6284722222222222 | 29.823 |
| 0.6291666666666667 | 29.823 |
| 0.6298611111111111 | 29.823 |
| 0.6305555555555555 | 34.234 |
| 0.63125 | 34.234 |
| 0.6319444444444444 | 34.234 |
| 0.6326388888888889 | 38.653 |
| 0.6333333333333333 | 38.653 |
| 0.6340277777777777 | 38.653 |
| 0.6347222222222222 | 38.653 |
| 0.6354166666666666 | 38.653 |
| 0.6361111111111112 | 34.234 |
| 0.6368055555555555 | 38.653 |
| 0.6375000000000001 | 34.234 |
| 0.6381944444444444 | 34.234 |
| 0.638888888888889 | 29.823 |
| 0.6395833333333333 | 29.823 |
| 0.6402777777777778 | 29.823 |
| 0.6409722222222222 | 29.823 |
| 0.6416666666666667 | 25.419 |
| 0.642361111111111 | 25.419 |
| 0.6430555555555556 | 25.419 |
| 0.6437499999999999 | 25.419 |
| 0.6444444444444445 | 21.024 |
| 0.6451388888888888 | 25.419 |
| 0.6458333333333334 | 29.823 |
| 0.6465277777777778 | 38.653 |
| 0.6472222222222223 | 38.653 |
| 0.6479166666666667 | 43.079 |
| 0.6486111111111111 | 43.079 |
| 0.6493055555555556 | 43.079 |
| 0.65 | 38.653 |
| 0.6506944444444445 | 43.079 |
| 0.6513888888888889 | 43.079 |
| 0.6520833333333333 | 38.653 |
| 0.6527777777777778 | 38.653 |
| 0.6534722222222222 | 38.653 |
| 0.6541666666666667 | 38.653 |
| 0.6548611111111111 | 38.653 |
| 0.6555555555555556 | 38.653 |
| 0.65625 | 34.234 |
| 0.6569444444444444 | 34.234 |
| 0.6576388888888889 | 29.823 |
| 0.6583333333333333 | 25.419 |
| 0.6590277777777778 | 21.024 |
| 0.6597222222222222 | 21.024 |
| 0.6604166666666667 | 21.024 |
| 0.6611111111111111 | 21.024 |
| 0.6618055555555555 | 16.636 |
| 0.6625 | 16.636 |
| 0.6631944444444444 | 16.636 |
| 0.6638888888888889 | 12.257 |
| 0.6645833333333333 | 12.257 |
| 0.6652777777777777 | 12.257 |
| 0.6659722222222222 | 16.636 |
| 0.6666666666666666 | 12.257 |
| 0.6673611111111111 | 12.257 |
| 0.6680555555555556 | 12.257 |
| 0.6687500000000001 | 12.257 |
| 0.6694444444444444 | 12.257 |
| 0.6701388888888888 | 12.257 |
| 0.6708333333333334 | 12.257 |
| 0.6715277777777778 | 12.257 |
| 0.6722222222222222 | 12.257 |
| 0.6729166666666666 | 16.636 |
| 0.6736111111111112 | 21.024 |
| 0.6743055555555556 | 21.024 |
| 0.6749999999999999 | 21.024 |
| 0.6756944444444444 | 21.024 |
| 0.6763888888888889 | 21.024 |
| 0.6770833333333334 | 16.636 |
| 0.6777777777777777 | 16.636 |
| 0.6784722222222223 | 16.636 |
| 0.6791666666666667 | 16.636 |
| 0.6798611111111111 | 16.636 |
| 0.6805555555555555 | 16.636 |
| 0.68125 | 16.636 |
| 0.6819444444444445 | 16.636 |
| 0.6826388888888889 | 16.636 |
| 0.6833333333333332 | 16.636 |
| 0.6840277777777778 | 16.636 |
| 0.6847222222222222 | 16.636 |
| 0.6854166666666667 | 16.636 |
| 0.686111111111111 | 16.636 |
| 0.6868055555555556 | 16.636 |
| 0.6875 | 16.636 |
| 0.6881944444444444 | 12.257 |
| 0.688888888888889 | 12.257 |
| 0.6895833333333333 | 12.257 |
| 0.6902777777777778 | 16.636 |
| 0.6909722222222222 | 16.636 |
| 0.6916666666666668 | 21.024 |
| 0.6923611111111111 | 21.024 |
| 0.6930555555555555 | 16.636 |
| 0.69375 | 16.636 |
| 0.6944444444444445 | 12.257 |
| 0.6951388888888889 | 12.257 |
| 0.6958333333333333 | 12.257 |
| 0.6965277777777777 | 12.257 |
| 0.6972222222222223 | 12.257 |
| 0.6979166666666666 | 7.887 |
| 0.6986111111111111 | 7.887 |
| 0.6993055555555556 | 7.887 |
| 0.7000000000000001 | 7.887 |
| 0.7006944444444444 | 7.887 |
| 0.7013888888888888 | 7.887 |
| 0.7020833333333334 | 7.887 |
| 0.7027777777777778 | 7.887 |
| 0.7034722222222222 | 7.887 |
| 0.7041666666666666 | 7.887 |
| 0.7048611111111112 | 7.887 |
| 0.7055555555555556 | 3.525 |
| 0.7062499999999999 | 3.525 |
| 0.7069444444444444 | 3.525 |
| 0.7076388888888889 | 3.525 |
| 0.7083333333333334 | 3.525 |
| 0.7090277777777777 | 3.525 |
| 0.7097222222222223 | 3.525 |
| 0.7104166666666667 | 3.525 |
| 0.7111111111111111 | 3.525 |
| 0.7118055555555555 | 3.525 |
| 0.7125 | 3.525 |
| 0.7131944444444445 | 0 |
| 0.7138888888888889 | 0 |
| 0.7145833333333332 | 0 |
| 0.7152777777777778 | 0 |
| 0.7159722222222222 | 0 |
| 0.7166666666666667 | 0 |
| 0.717361111111111 | 0 |
| 0.7180555555555556 | 0 |
| 0.71875 | 0 |
| 0.7194444444444444 | 0 |
| 0.720138888888889 | 0 |
| 0.7208333333333333 | 0 |
| 0.7215277777777778 | 0 |
| 0.7222222222222222 | 0 |
| 0.7229166666666668 | 0 |
| 0.7236111111111111 | 0 |
| 0.7243055555555555 | 0 |
| 0.725 | 0 |
| 0.7256944444444445 | 0 |
| 0.7263888888888889 | 0 |
| 0.7270833333333333 | 0 |
| 0.7277777777777777 | 0 |
| 0.7284722222222223 | 0 |
| 0.7291666666666666 | 0 |
| 0.7298611111111111 | 0 |
| 0.7305555555555556 | 0 |
| 0.7312500000000001 | 0 |
| 0.7319444444444444 | 0 |
| 0.7326388888888888 | 0 |
| 0.7333333333333334 | 0 |
| 0.7340277777777778 | 0 |
| 0.7347222222222222 | 0 |
| 0.7354166666666666 | 0 |
| 0.7361111111111112 | 0 |
| 0.7368055555555556 | 0 |
| 0.7374999999999999 | 0 |
| 0.7381944444444444 | 0 |
| 0.7388888888888889 | 0 |
| 0.7395833333333334 | 0 |
| 0.7402777777777777 | 0 |
| 0.7409722222222223 | 0 |
| 0.7416666666666667 | 0 |
| 0.7423611111111111 | 0 |
| 0.7430555555555555 | 0 |
| 0.74375 | 0 |
| 0.7444444444444445 | 0 |
| 0.7451388888888889 | 0 |
| 0.7458333333333332 | 0 |
| 0.7465277777777778 | 0 |
| 0.7472222222222222 | 0 |
| 0.7479166666666667 | 0 |
| 0.748611111111111 | 0 |
| 0.7493055555555556 | 0 |
| 0.75 | 0 |
| 0.7506944444444444 | 0 |
| 0.751388888888889 | 0 |
| 0.7520833333333333 | 0 |
| 0.7527777777777778 | 0 |
| 0.7534722222222222 | 0 |
| 0.7541666666666668 | 0 |
| 0.7548611111111111 | 0 |
| 0.7555555555555555 | 0 |
| 0.75625 | 0 |
| 0.7569444444444445 | 0 |
| 0.7576388888888889 | 0 |
| 0.7583333333333333 | 0 |
| 0.7590277777777777 | 0 |
| 0.7597222222222223 | 0 |
| 0.7604166666666666 | 0 |
| 0.7611111111111111 | 0 |
| 0.7618055555555556 | 0 |
| 0.7625000000000001 | 0 |
| 0.7631944444444444 | 0 |
| 0.7638888888888888 | 0 |
| 0.7645833333333334 | 0 |
| 0.7652777777777778 | 0 |
| 0.7659722222222222 | 0 |
| 0.7666666666666666 | 0 |
| 0.7673611111111112 | 0 |
| 0.7680555555555556 | 0 |
| 0.7687499999999999 | 0 |
| 0.7694444444444444 | 0 |
| 0.7701388888888889 | 0 |
| 0.7708333333333334 | 0 |
| 0.7715277777777777 | 0 |
| 0.7722222222222223 | 0 |
| 0.7729166666666667 | 0 |
| 0.7736111111111111 | 0 |
| 0.7743055555555555 | 0 |
| 0.775 | 0 |
| 0.7756944444444445 | 0 |
| 0.7763888888888889 | 0 |
| 0.7770833333333332 | 0 |
| 0.7777777777777778 | 0 |
| 0.7784722222222222 | 0 |
| 0.7791666666666667 | 0 |
| 0.779861111111111 | 0 |
| 0.7805555555555556 | 0 |
| 0.78125 | 0 |
| 0.7819444444444444 | 0 |
| 0.782638888888889 | 0 |
| 0.7833333333333333 | 0 |
| 0.7840277777777778 | 0 |
| 0.7847222222222222 | 0 |
| 0.7854166666666668 | 0 |
| 0.7861111111111111 | 0 |
| 0.7868055555555555 | 0 |
| 0.7875 | 0 |
| 0.7881944444444445 | 0 |
| 0.7888888888888889 | 0 |
| 0.7895833333333333 | 0 |
| 0.7902777777777777 | 0 |
| 0.7909722222222223 | 0 |
| 0.7916666666666666 | 0 |
| 0.7923611111111111 | 0 |
| 0.7930555555555556 | 0 |
| 0.7937500000000001 | 0 |
| 0.7944444444444444 | 0 |
| 0.7951388888888888 | 0 |
| 0.7958333333333334 | 0 |
| 0.7965277777777778 | 0 |
| 0.7972222222222222 | 0 |
| 0.7979166666666666 | 0 |
| 0.7986111111111112 | 0 |
| 0.7993055555555556 | 0 |
| 0.7999999999999999 | 0 |
| 0.8006944444444444 | 0 |
| 0.8013888888888889 | 0 |
| 0.8020833333333334 | 0 |
| 0.8027777777777777 | 0 |
| 0.8034722222222223 | 0 |
| 0.8041666666666667 | 0 |
| 0.8048611111111111 | 0 |
| 0.8055555555555555 | 0 |
| 0.80625 | 0 |
| 0.8069444444444445 | 0 |
| 0.8076388888888889 | 0 |
| 0.8083333333333332 | 0 |
| 0.8090277777777778 | 0 |
| 0.8097222222222222 | 0 |
| 0.8104166666666667 | 0 |
| 0.811111111111111 | 0 |
| 0.8118055555555556 | 0 |
| 0.8125 | 0 |
| 0.8131944444444444 | 0 |
| 0.813888888888889 | 0 |
| 0.8145833333333333 | 0 |
| 0.8152777777777778 | 0 |
| 0.8159722222222222 | 0 |
| 0.8166666666666668 | 0 |
| 0.8173611111111111 | 0 |
| 0.8180555555555555 | 0 |
| 0.81875 | 0 |
| 0.8194444444444445 | 0 |
| 0.8201388888888889 | 0 |
| 0.8208333333333333 | 0 |
| 0.8215277777777777 | 0 |
| 0.8222222222222223 | 0 |
| 0.8229166666666666 | 0 |
| 0.8236111111111111 | 0 |
| 0.8243055555555556 | 0 |
| 0.8250000000000001 | 0 |
| 0.8256944444444444 | 0 |
| 0.8263888888888888 | 0 |
| 0.8270833333333334 | 0 |
| 0.8277777777777778 | 0 |
| 0.8284722222222222 | 0 |
| 0.8291666666666666 | 0 |
| 0.8298611111111112 | 0 |
| 0.8305555555555556 | 0 |
| 0.8312499999999999 | 0 |
| 0.8319444444444444 | 0 |
| 0.8326388888888889 | 0 |
| 0.8333333333333334 | 0 |
| 0.8340277777777777 | 0 |
| 0.8347222222222223 | 0 |
| 0.8354166666666667 | 0 |
| 0.8361111111111111 | 0 |
| 0.8368055555555555 | 0 |
| 0.8375 | 0 |
| 0.8381944444444445 | 0 |
| 0.8388888888888889 | 0 |
| 0.8395833333333332 | 0 |
| 0.8402777777777778 | 0 |
| 0.8409722222222222 | 0 |
| 0.8416666666666667 | 0 |
| 0.842361111111111 | 0 |
| 0.8430555555555556 | 0 |
| 0.84375 | 0 |
| 0.8444444444444444 | 0 |
| 0.845138888888889 | 0 |
| 0.8458333333333333 | 0 |
| 0.8465277777777778 | 0 |
| 0.8472222222222222 | 0 |
| 0.8479166666666668 | 0 |
| 0.8486111111111111 | 0 |
| 0.8493055555555555 | 0 |
| 0.85 | 0 |
| 0.8506944444444445 | 0 |
| 0.8513888888888889 | 0 |
| 0.8520833333333333 | 0 |
| 0.8527777777777777 | 0 |
| 0.8534722222222223 | 0 |
| 0.8541666666666666 | 0 |
| 0.8548611111111111 | 0 |
| 0.8555555555555556 | 0 |
| 0.8562500000000001 | 0 |
| 0.8569444444444444 | 0 |
| 0.8576388888888888 | 0 |
| 0.8583333333333334 | 0 |
| 0.8590277777777778 | 0 |
| 0.8597222222222222 | 0 |
| 0.8604166666666666 | 0 |
| 0.8611111111111112 | 0 |
| 0.8618055555555556 | 0 |
| 0.8624999999999999 | 0 |
| 0.8631944444444444 | 0 |
| 0.8638888888888889 | 0 |
| 0.8645833333333334 | 0 |
| 0.8652777777777777 | 0 |
| 0.8659722222222223 | 0 |
| 0.8666666666666667 | 0 |
| 0.8673611111111111 | 0 |
| 0.8680555555555555 | 0 |
| 0.86875 | 0 |
| 0.8694444444444445 | 0 |
| 0.8701388888888889 | 0 |
| 0.8708333333333332 | 0 |
| 0.8715277777777778 | 0 |
| 0.8722222222222222 | 0 |
| 0.8729166666666667 | 0 |
| 0.873611111111111 | 0 |
| 0.8743055555555556 | 0 |
| 0.875 | 0 |
| 0.8756944444444444 | 0 |
| 0.876388888888889 | 0 |
| 0.8770833333333333 | 0 |
| 0.8777777777777778 | 0 |
| 0.8784722222222222 | 0 |
| 0.8791666666666668 | 0 |
| 0.8798611111111111 | 0 |
| 0.8805555555555555 | 0 |
| 0.88125 | 0 |
| 0.8819444444444445 | 0 |
| 0.8826388888888889 | 0 |
| 0.8833333333333333 | 0 |
| 0.8840277777777777 | 0 |
| 0.8847222222222223 | 0 |
| 0.8854166666666666 | 0 |
| 0.8861111111111111 | 0 |
| 0.8868055555555556 | 0 |
| 0.8875000000000001 | 0 |
| 0.8881944444444444 | 0 |
| 0.8888888888888888 | 0 |
| 0.8895833333333334 | 0 |
| 0.8902777777777778 | 0 |
| 0.8909722222222222 | 0 |
| 0.8916666666666666 | 0 |
| 0.8923611111111112 | 0 |
| 0.8930555555555556 | 0 |
| 0.8937499999999999 | 0 |
| 0.8944444444444444 | 0 |
| 0.8951388888888889 | 0 |
| 0.8958333333333334 | 0 |
| 0.8965277777777777 | 0 |
| 0.8972222222222223 | 0 |
| 0.8979166666666667 | 0 |
| 0.8986111111111111 | 0 |
| 0.8993055555555555 | 0 |
| 0.9 | 0 |
| 0.9006944444444445 | 0 |
| 0.9013888888888889 | 0 |
| 0.9020833333333332 | 0 |
| 0.9027777777777778 | 0 |
| 0.9034722222222222 | 0 |
| 0.9041666666666667 | 0 |
| 0.904861111111111 | 0 |
| 0.9055555555555556 | 0 |
| 0.90625 | 0 |
| 0.9069444444444444 | 0 |
| 0.907638888888889 | 0 |
| 0.9083333333333333 | 0 |
| 0.9090277777777778 | 0 |
| 0.9097222222222222 | 0 |
| 0.9104166666666668 | 0 |
| 0.9111111111111111 | 0 |
| 0.9118055555555555 | 0 |
| 0.9125 | 0 |
| 0.9131944444444445 | 0 |
| 0.9138888888888889 | 0 |
| 0.9145833333333333 | 0 |
| 0.9152777777777777 | 0 |
| 0.9159722222222223 | 0 |
| 0.9166666666666666 | 0 |
| 0.9173611111111111 | 0 |
| 0.9180555555555556 | 0 |
| 0.9187500000000001 | 0 |
| 0.9194444444444444 | 0 |
| 0.9201388888888888 | 0 |
| 0.9208333333333334 | 0 |
| 0.9215277777777778 | 0 |
| 0.9222222222222222 | 0 |
| 0.9229166666666666 | 0 |
| 0.9236111111111112 | 0 |
| 0.9243055555555556 | 0 |
| 0.9249999999999999 | 0 |
| 0.9256944444444444 | 0 |
| 0.9263888888888889 | 0 |
| 0.9270833333333334 | 0 |
| 0.9277777777777777 | 0 |
| 0.9284722222222223 | 0 |
| 0.9291666666666667 | 0 |
| 0.9298611111111111 | 0 |
| 0.9305555555555555 | 0 |
| 0.93125 | 0 |
| 0.9319444444444445 | 0 |
| 0.9326388888888889 | 0 |
| 0.9333333333333332 | 0 |
| 0.9340277777777778 | 0 |
| 0.9347222222222222 | 0 |
| 0.9354166666666667 | 0 |
| 0.936111111111111 | 0 |
| 0.9368055555555556 | 0 |
| 0.9375 | 0 |
| 0.9381944444444444 | 0 |
| 0.938888888888889 | 0 |
| 0.9395833333333333 | 0 |
| 0.9402777777777778 | 0 |
| 0.9409722222222222 | 0 |
| 0.9416666666666668 | 0 |
| 0.9423611111111111 | 0 |
| 0.9430555555555555 | 0 |
| 0.94375 | 0 |
| 0.9444444444444445 | 0 |
| 0.9451388888888889 | 0 |
| 0.9458333333333333 | 0 |
| 0.9465277777777777 | 0 |
| 0.9472222222222223 | 0 |
| 0.9479166666666666 | 0 |
| 0.9486111111111111 | 0 |
| 0.9493055555555556 | 0 |
| 0.9500000000000001 | 0 |
| 0.9506944444444444 | 0 |
| 0.9513888888888888 | 0 |
| 0.9520833333333334 | 0 |
| 0.9527777777777778 | 0 |
| 0.9534722222222222 | 0 |
| 0.9541666666666666 | 0 |
| 0.9548611111111112 | 0 |
| 0.9555555555555556 | 0 |
| 0.9562499999999999 | 0 |
| 0.9569444444444444 | 0 |
| 0.9576388888888889 | 0 |
| 0.9583333333333334 | 0 |
| 0.9590277777777777 | 0 |
| 0.9597222222222223 | 0 |
| 0.9604166666666667 | 0 |
| 0.9611111111111111 | 0 |
| 0.9618055555555555 | 0 |
| 0.9625 | 0 |
| 0.9631944444444445 | 0 |
| 0.9638888888888889 | 0 |
| 0.9645833333333332 | 0 |
| 0.9652777777777778 | 0 |
| 0.9659722222222222 | 0 |
| 0.9666666666666667 | 0 |
| 0.967361111111111 | 0 |
| 0.9680555555555556 | 0 |
| 0.96875 | 0 |
| 0.9694444444444444 | 0 |
| 0.970138888888889 | 0 |
| 0.9708333333333333 | 0 |
| 0.9715277777777778 | 0 |
| 0.9722222222222222 | 0 |
| 0.9729166666666668 | 0 |
| 0.9736111111111111 | 0 |
| 0.9743055555555555 | 0 |
| 0.975 | 0 |
| 0.9756944444444445 | 0 |
| 0.9763888888888889 | 0 |
| 0.9770833333333333 | 0 |
| 0.9777777777777777 | 0 |
| 0.9784722222222223 | 0 |
| 0.9791666666666666 | 0 |
| 0.9798611111111111 | 0 |
| 0.9805555555555556 | 0 |
| 0.9812500000000001 | 0 |
| 0.9819444444444444 | 0 |
| 0.9826388888888888 | 0 |
| 0.9833333333333334 | 0 |
| 0.9840277777777778 | 0 |
| 0.9847222222222222 | 0 |
| 0.9854166666666666 | 0 |
| 0.9861111111111112 | 0 |
| 0.9868055555555556 | 0 |
| 0.9874999999999999 | 0 |
| 0.9881944444444444 | 0 |
| 0.9888888888888889 | 0 |
| 0.9895833333333334 | 0 |
| 0.9902777777777777 | 0 |
| 0.9909722222222223 | 0 |
| 0.9916666666666667 | 0 |
| 0.9923611111111111 | 0 |
| 0.9930555555555555 | 0 |
| 0.99375 | 0 |
| 0.9944444444444445 | 0 |
| 0.9951388888888889 | 0 |
| 0.9958333333333332 | 0 |
| 0.9965277777777778 | 0 |
| 0.9972222222222222 | 0 |
| 0.9979166666666667 | 0 |
| 0.998611111111111 | 0 |
| 0.9993055555555556 | 0 |